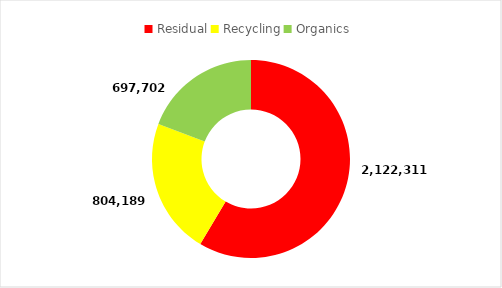
| Category | Series 0 |
|---|---|
| Residual | 2122311.42 |
| Recycling | 804189.08 |
| Organics | 697702.01 |